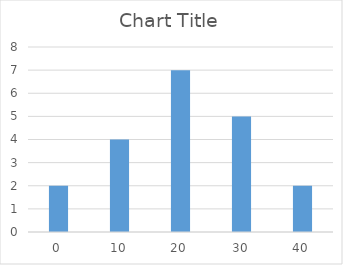
| Category | Series 0 |
|---|---|
| 0.0 | 2 |
| 10.0 | 4 |
| 20.0 | 7 |
| 30.0 | 5 |
| 40.0 | 2 |